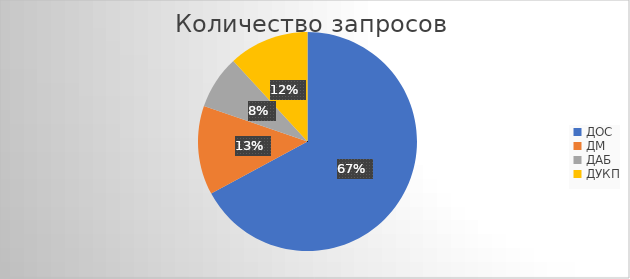
| Category | Количество запросов |
|---|---|
| ${department} | 0 |